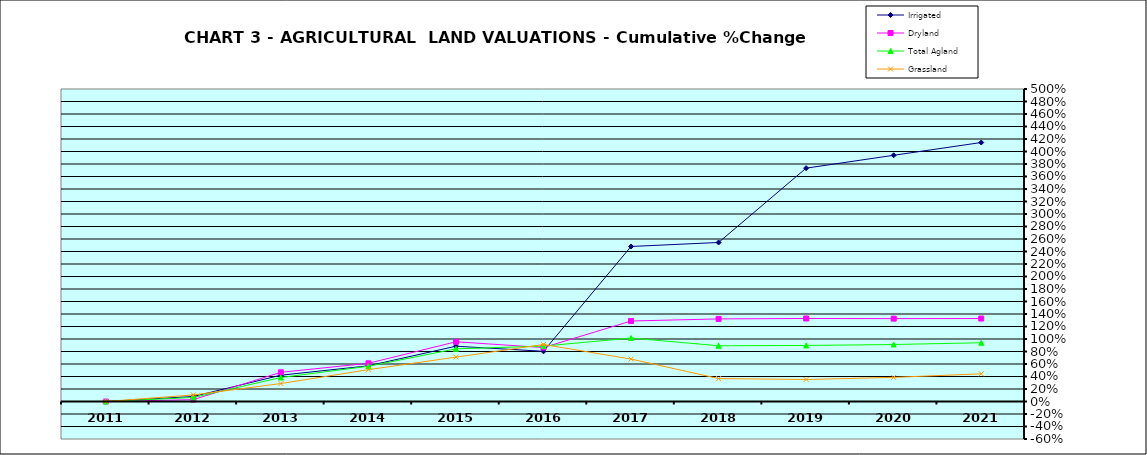
| Category | Irrigated | Dryland | Total Agland | Grassland |
|---|---|---|---|---|
| 2011.0 | 0 | 0 | 0 | 0 |
| 2012.0 | 0.08 | 0.03 | 0.065 | 0.105 |
| 2013.0 | 0.421 | 0.467 | 0.384 | 0.287 |
| 2014.0 | 0.571 | 0.611 | 0.564 | 0.51 |
| 2015.0 | 0.885 | 0.956 | 0.843 | 0.71 |
| 2016.0 | 0.803 | 0.863 | 0.886 | 0.912 |
| 2017.0 | 2.48 | 1.288 | 1.016 | 0.679 |
| 2018.0 | 2.544 | 1.321 | 0.892 | 0.367 |
| 2019.0 | 3.734 | 1.328 | 0.897 | 0.352 |
| 2020.0 | 3.939 | 1.326 | 0.912 | 0.386 |
| 2021.0 | 4.144 | 1.327 | 0.94 | 0.443 |